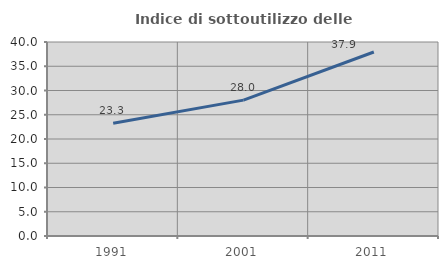
| Category | Indice di sottoutilizzo delle abitazioni  |
|---|---|
| 1991.0 | 23.26 |
| 2001.0 | 28.017 |
| 2011.0 | 37.94 |